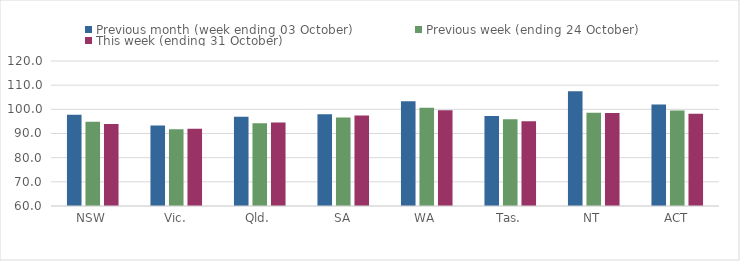
| Category | Previous month (week ending 03 October) | Previous week (ending 24 October) | This week (ending 31 October) |
|---|---|---|---|
| NSW | 97.78 | 94.9 | 93.88 |
| Vic. | 93.29 | 91.76 | 91.96 |
| Qld. | 96.89 | 94.2 | 94.55 |
| SA | 98.01 | 96.59 | 97.44 |
| WA | 103.31 | 100.63 | 99.67 |
| Tas. | 97.19 | 95.93 | 95.12 |
| NT | 107.5 | 98.58 | 98.5 |
| ACT | 102.01 | 99.55 | 98.13 |